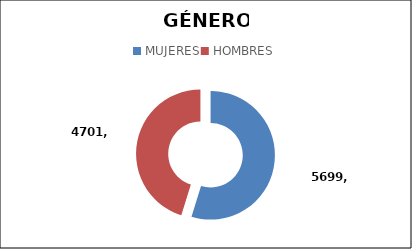
| Category | Series 0 |
|---|---|
| MUJERES | 5699 |
| HOMBRES | 4701 |